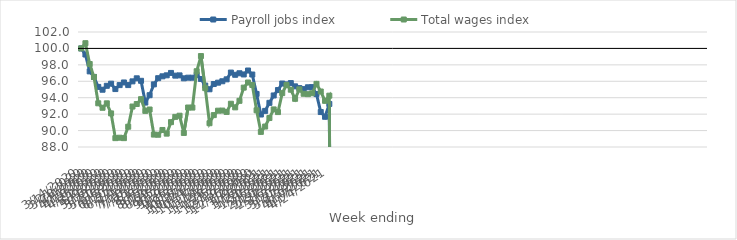
| Category | Payroll jobs index | Total wages index |
|---|---|---|
| 14/03/2020 | 100 | 100 |
| 21/03/2020 | 99.26 | 100.636 |
| 28/03/2020 | 97.205 | 98.104 |
| 04/04/2020 | 96.532 | 96.524 |
| 11/04/2020 | 95.314 | 93.319 |
| 18/04/2020 | 94.973 | 92.775 |
| 25/04/2020 | 95.45 | 93.316 |
| 02/05/2020 | 95.71 | 92.088 |
| 09/05/2020 | 95.052 | 89.08 |
| 16/05/2020 | 95.535 | 89.131 |
| 23/05/2020 | 95.856 | 89.08 |
| 30/05/2020 | 95.537 | 90.469 |
| 06/06/2020 | 95.991 | 92.926 |
| 13/06/2020 | 96.361 | 93.234 |
| 20/06/2020 | 96.058 | 93.824 |
| 27/06/2020 | 93.41 | 92.397 |
| 04/07/2020 | 94.307 | 92.564 |
| 11/07/2020 | 95.625 | 89.512 |
| 18/07/2020 | 96.376 | 89.492 |
| 25/07/2020 | 96.605 | 90.072 |
| 01/08/2020 | 96.726 | 89.627 |
| 08/08/2020 | 97.017 | 91.026 |
| 15/08/2020 | 96.688 | 91.669 |
| 22/08/2020 | 96.719 | 91.81 |
| 29/08/2020 | 96.361 | 89.71 |
| 05/09/2020 | 96.439 | 92.807 |
| 12/09/2020 | 96.433 | 92.799 |
| 19/09/2020 | 96.767 | 97.224 |
| 26/09/2020 | 96.282 | 99.072 |
| 03/10/2020 | 95.479 | 95.165 |
| 10/10/2020 | 95.028 | 90.897 |
| 17/10/2020 | 95.667 | 91.882 |
| 24/10/2020 | 95.83 | 92.421 |
| 31/10/2020 | 96.003 | 92.435 |
| 07/11/2020 | 96.238 | 92.266 |
| 14/11/2020 | 97.061 | 93.267 |
| 21/11/2020 | 96.791 | 92.825 |
| 28/11/2020 | 96.977 | 93.623 |
| 05/12/2020 | 96.831 | 95.228 |
| 12/12/2020 | 97.312 | 95.848 |
| 19/12/2020 | 96.823 | 95.55 |
| 26/12/2020 | 94.459 | 92.47 |
| 02/01/2021 | 91.954 | 89.84 |
| 09/01/2021 | 92.397 | 90.49 |
| 16/01/2021 | 93.376 | 91.528 |
| 23/01/2021 | 94.275 | 92.577 |
| 30/01/2021 | 94.932 | 92.25 |
| 06/02/2021 | 95.728 | 94.56 |
| 13/02/2021 | 95.619 | 95.542 |
| 20/02/2021 | 95.782 | 94.976 |
| 27/02/2021 | 95.383 | 93.866 |
| 06/03/2021 | 95.172 | 95.015 |
| 13/03/2021 | 95.047 | 94.479 |
| 20/03/2021 | 95.269 | 94.433 |
| 27/03/2021 | 95.292 | 94.541 |
| 03/04/2021 | 94.442 | 95.685 |
| 10/04/2021 | 92.256 | 94.756 |
| 17/04/2021 | 91.677 | 93.619 |
| 24/04/2021 | 93.239 | 94.247 |